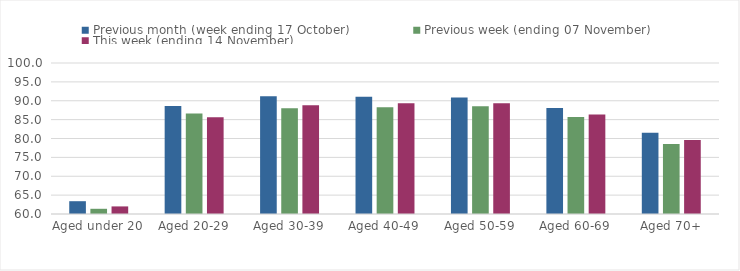
| Category | Previous month (week ending 17 October) | Previous week (ending 07 November) | This week (ending 14 November) |
|---|---|---|---|
| Aged under 20 | 63.39 | 61.38 | 62.01 |
| Aged 20-29 | 88.6 | 86.63 | 85.64 |
| Aged 30-39 | 91.21 | 88.01 | 88.79 |
| Aged 40-49 | 91.03 | 88.3 | 89.34 |
| Aged 50-59 | 90.84 | 88.56 | 89.37 |
| Aged 60-69 | 88.07 | 85.69 | 86.37 |
| Aged 70+ | 81.53 | 78.55 | 79.61 |